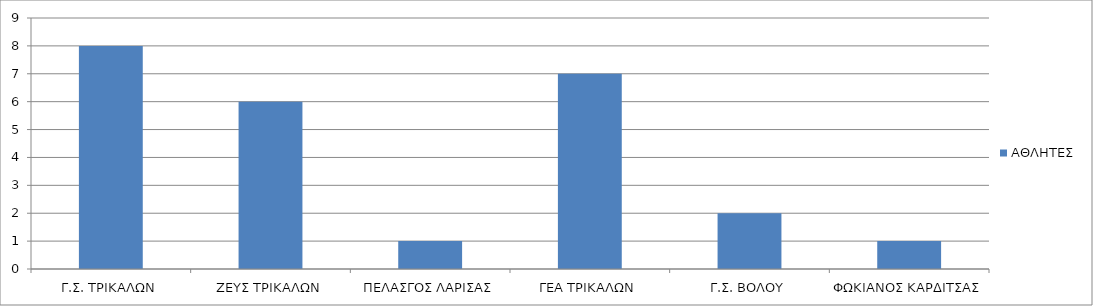
| Category | ΑΘΛΗΤΕΣ |
|---|---|
| Γ.Σ. ΤΡΙΚΑΛΩΝ | 8 |
| ΖΕΥΣ ΤΡΙΚΑΛΩΝ | 6 |
| ΠΕΛΑΣΓΟΣ ΛΑΡΙΣΑΣ | 1 |
| ΓΕΑ ΤΡΙΚΑΛΩΝ | 7 |
| Γ.Σ. ΒΟΛΟΥ | 2 |
| ΦΩΚΙΑΝΟΣ ΚΑΡΔΙΤΣΑΣ | 1 |